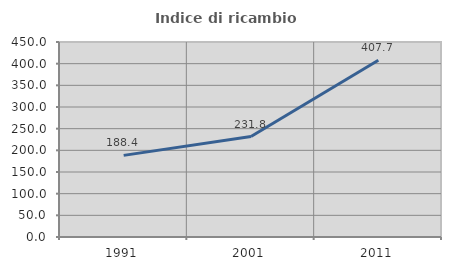
| Category | Indice di ricambio occupazionale  |
|---|---|
| 1991.0 | 188.357 |
| 2001.0 | 231.776 |
| 2011.0 | 407.728 |